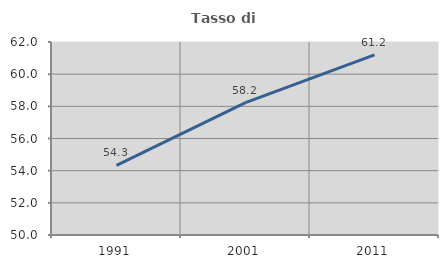
| Category | Tasso di occupazione   |
|---|---|
| 1991.0 | 54.327 |
| 2001.0 | 58.226 |
| 2011.0 | 61.201 |